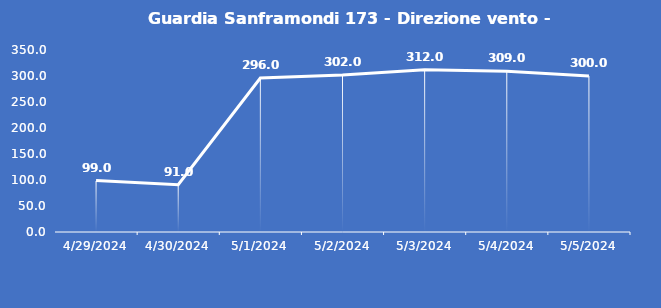
| Category | Guardia Sanframondi 173 - Direzione vento - Grezzo (°N) |
|---|---|
| 4/29/24 | 99 |
| 4/30/24 | 91 |
| 5/1/24 | 296 |
| 5/2/24 | 302 |
| 5/3/24 | 312 |
| 5/4/24 | 309 |
| 5/5/24 | 300 |